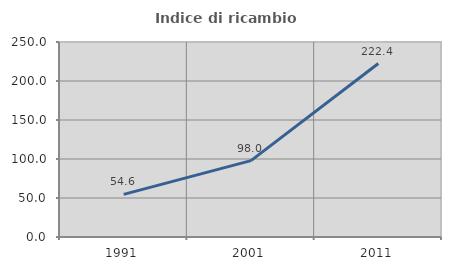
| Category | Indice di ricambio occupazionale  |
|---|---|
| 1991.0 | 54.622 |
| 2001.0 | 97.98 |
| 2011.0 | 222.388 |